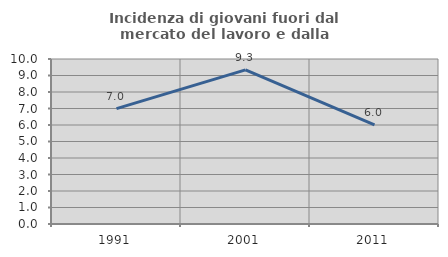
| Category | Incidenza di giovani fuori dal mercato del lavoro e dalla formazione  |
|---|---|
| 1991.0 | 6.995 |
| 2001.0 | 9.341 |
| 2011.0 | 6.013 |